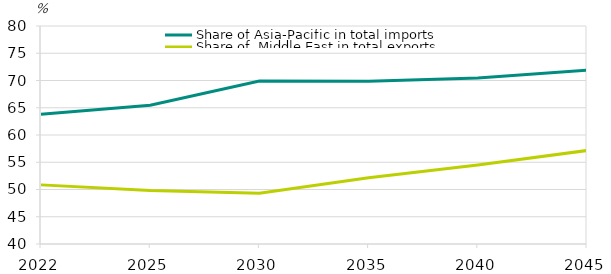
| Category | Share of Asia-Pacific in total imports | Share of  Middle East in total exports |
|---|---|---|
| 2022.0 | 63.786 | 50.848 |
| 2025.0 | 65.465 | 49.822 |
| 2030.0 | 69.915 | 49.309 |
| 2035.0 | 69.848 | 52.144 |
| 2040.0 | 70.438 | 54.484 |
| 2045.0 | 71.914 | 57.155 |